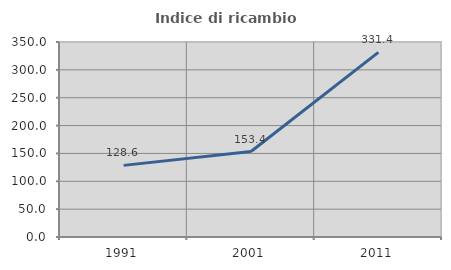
| Category | Indice di ricambio occupazionale  |
|---|---|
| 1991.0 | 128.571 |
| 2001.0 | 153.409 |
| 2011.0 | 331.429 |